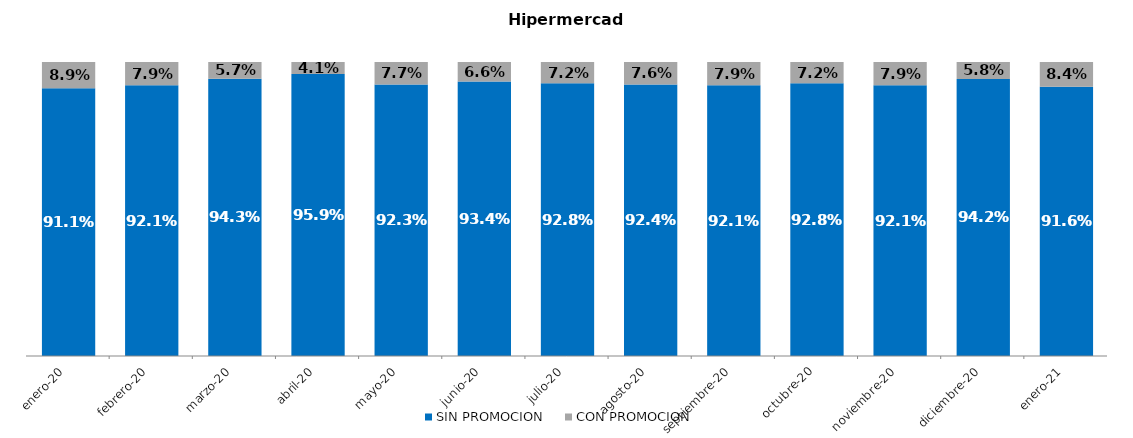
| Category | SIN PROMOCION   | CON PROMOCION   |
|---|---|---|
| 2020-01-01 | 0.911 | 0.089 |
| 2020-02-01 | 0.921 | 0.079 |
| 2020-03-01 | 0.943 | 0.057 |
| 2020-04-01 | 0.959 | 0.041 |
| 2020-05-01 | 0.923 | 0.077 |
| 2020-06-01 | 0.934 | 0.066 |
| 2020-07-01 | 0.928 | 0.072 |
| 2020-08-01 | 0.924 | 0.076 |
| 2020-09-01 | 0.921 | 0.079 |
| 2020-10-01 | 0.928 | 0.072 |
| 2020-11-01 | 0.921 | 0.079 |
| 2020-12-01 | 0.942 | 0.058 |
| 2021-01-01 | 0.916 | 0.084 |